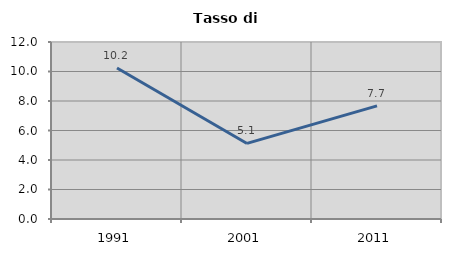
| Category | Tasso di disoccupazione   |
|---|---|
| 1991.0 | 10.237 |
| 2001.0 | 5.124 |
| 2011.0 | 7.672 |